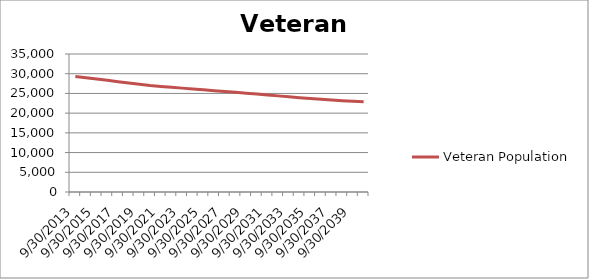
| Category | Veteran Population |
|---|---|
|  9/30/2013 | 29313.937 |
|  9/30/2014 | 28961.304 |
|  9/30/2015 | 28633.368 |
|  9/30/2016 | 28313.458 |
|  9/30/2017 | 27974.512 |
|  9/30/2018 | 27642.13 |
|  9/30/2019 | 27316.933 |
|  9/30/2020 | 27004.817 |
|  9/30/2021 | 26782.167 |
|  9/30/2022 | 26564.897 |
|  9/30/2023 | 26345.889 |
|  9/30/2024 | 26130.214 |
|  9/30/2025 | 25919.34 |
|  9/30/2026 | 25703.663 |
|  9/30/2027 | 25491.973 |
|  9/30/2028 | 25274.086 |
|  9/30/2029 | 25057.759 |
|  9/30/2030 | 24834.97 |
|  9/30/2031 | 24612.313 |
|  9/30/2032 | 24379.477 |
|  9/30/2033 | 24147.748 |
|  9/30/2034 | 23924.738 |
|  9/30/2035 | 23707.758 |
|  9/30/2036 | 23501.528 |
|  9/30/2037 | 23312.527 |
|  9/30/2038 | 23140.685 |
|  9/30/2039 | 22993.145 |
|  9/30/2040 | 22862.878 |